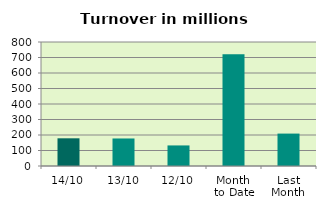
| Category | Series 0 |
|---|---|
| 14/10 | 178.653 |
| 13/10 | 177.564 |
| 12/10 | 132.693 |
| Month 
to Date | 721.418 |
| Last
Month | 209.117 |